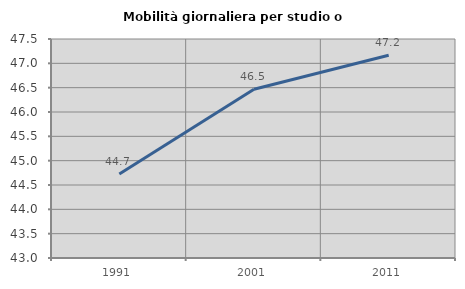
| Category | Mobilità giornaliera per studio o lavoro |
|---|---|
| 1991.0 | 44.727 |
| 2001.0 | 46.469 |
| 2011.0 | 47.165 |